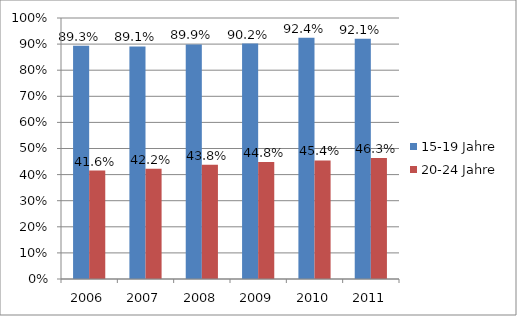
| Category | 15-19 Jahre | 20-24 Jahre |
|---|---|---|
| 2006.0 | 0.893 | 0.416 |
| 2007.0 | 0.891 | 0.422 |
| 2008.0 | 0.899 | 0.438 |
| 2009.0 | 0.902 | 0.448 |
| 2010.0 | 0.924 | 0.454 |
| 2011.0 | 0.921 | 0.463 |